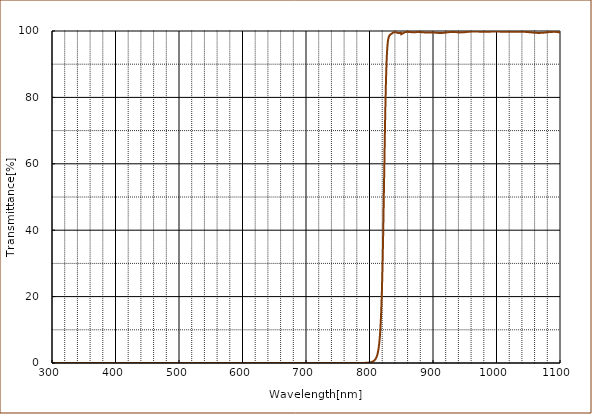
| Category | T% at AOI 0 deg |
|---|---|
| 1100.0 | 99.562 |
| 1099.5 | 99.598 |
| 1099.0 | 99.61 |
| 1098.5 | 99.617 |
| 1098.0 | 99.625 |
| 1097.5 | 99.64 |
| 1097.0 | 99.673 |
| 1096.5 | 99.697 |
| 1096.0 | 99.682 |
| 1095.5 | 99.689 |
| 1095.0 | 99.699 |
| 1094.5 | 99.74 |
| 1094.0 | 99.737 |
| 1093.5 | 99.712 |
| 1093.0 | 99.719 |
| 1092.5 | 99.74 |
| 1092.0 | 99.735 |
| 1091.5 | 99.736 |
| 1091.0 | 99.755 |
| 1090.5 | 99.763 |
| 1090.0 | 99.753 |
| 1089.5 | 99.756 |
| 1089.0 | 99.744 |
| 1088.5 | 99.749 |
| 1088.0 | 99.731 |
| 1087.5 | 99.726 |
| 1087.0 | 99.729 |
| 1086.5 | 99.74 |
| 1086.0 | 99.718 |
| 1085.5 | 99.715 |
| 1085.0 | 99.719 |
| 1084.5 | 99.703 |
| 1084.0 | 99.709 |
| 1083.5 | 99.689 |
| 1083.0 | 99.67 |
| 1082.5 | 99.682 |
| 1082.0 | 99.656 |
| 1081.5 | 99.635 |
| 1081.0 | 99.625 |
| 1080.5 | 99.623 |
| 1080.0 | 99.639 |
| 1079.5 | 99.619 |
| 1079.0 | 99.589 |
| 1078.5 | 99.582 |
| 1078.0 | 99.568 |
| 1077.5 | 99.548 |
| 1077.0 | 99.554 |
| 1076.5 | 99.538 |
| 1076.0 | 99.528 |
| 1075.5 | 99.52 |
| 1075.0 | 99.519 |
| 1074.5 | 99.494 |
| 1074.0 | 99.497 |
| 1073.5 | 99.483 |
| 1073.0 | 99.473 |
| 1072.5 | 99.481 |
| 1072.0 | 99.465 |
| 1071.5 | 99.438 |
| 1071.0 | 99.426 |
| 1070.5 | 99.442 |
| 1070.0 | 99.452 |
| 1069.5 | 99.453 |
| 1069.0 | 99.432 |
| 1068.5 | 99.422 |
| 1068.0 | 99.424 |
| 1067.5 | 99.428 |
| 1067.0 | 99.419 |
| 1066.5 | 99.423 |
| 1066.0 | 99.422 |
| 1065.5 | 99.427 |
| 1065.0 | 99.441 |
| 1064.5 | 99.437 |
| 1064.0 | 99.434 |
| 1063.5 | 99.446 |
| 1063.0 | 99.448 |
| 1062.5 | 99.439 |
| 1062.0 | 99.457 |
| 1061.5 | 99.455 |
| 1061.0 | 99.462 |
| 1060.5 | 99.48 |
| 1060.0 | 99.492 |
| 1059.5 | 99.493 |
| 1059.0 | 99.496 |
| 1058.5 | 99.517 |
| 1058.0 | 99.514 |
| 1057.5 | 99.532 |
| 1057.0 | 99.541 |
| 1056.5 | 99.524 |
| 1056.0 | 99.556 |
| 1055.5 | 99.579 |
| 1055.0 | 99.567 |
| 1054.5 | 99.573 |
| 1054.0 | 99.606 |
| 1053.5 | 99.606 |
| 1053.0 | 99.623 |
| 1052.5 | 99.627 |
| 1052.0 | 99.633 |
| 1051.5 | 99.636 |
| 1051.0 | 99.643 |
| 1050.5 | 99.662 |
| 1050.0 | 99.672 |
| 1049.5 | 99.687 |
| 1049.0 | 99.706 |
| 1048.5 | 99.707 |
| 1048.0 | 99.724 |
| 1047.5 | 99.708 |
| 1047.0 | 99.715 |
| 1046.5 | 99.724 |
| 1046.0 | 99.731 |
| 1045.5 | 99.747 |
| 1045.0 | 99.747 |
| 1044.5 | 99.76 |
| 1044.0 | 99.766 |
| 1043.5 | 99.766 |
| 1043.0 | 99.775 |
| 1042.5 | 99.775 |
| 1042.0 | 99.779 |
| 1041.5 | 99.777 |
| 1041.0 | 99.779 |
| 1040.5 | 99.786 |
| 1040.0 | 99.787 |
| 1039.5 | 99.785 |
| 1039.0 | 99.794 |
| 1038.5 | 99.797 |
| 1038.0 | 99.807 |
| 1037.5 | 99.8 |
| 1037.0 | 99.785 |
| 1036.5 | 99.79 |
| 1036.0 | 99.791 |
| 1035.5 | 99.793 |
| 1035.0 | 99.801 |
| 1034.5 | 99.792 |
| 1034.0 | 99.788 |
| 1033.5 | 99.79 |
| 1033.0 | 99.801 |
| 1032.5 | 99.798 |
| 1032.0 | 99.786 |
| 1031.5 | 99.784 |
| 1031.0 | 99.785 |
| 1030.5 | 99.776 |
| 1030.0 | 99.781 |
| 1029.5 | 99.782 |
| 1029.0 | 99.785 |
| 1028.5 | 99.78 |
| 1028.0 | 99.788 |
| 1027.5 | 99.773 |
| 1027.0 | 99.776 |
| 1026.5 | 99.772 |
| 1026.0 | 99.778 |
| 1025.5 | 99.762 |
| 1025.0 | 99.767 |
| 1024.5 | 99.766 |
| 1024.0 | 99.763 |
| 1023.5 | 99.772 |
| 1023.0 | 99.77 |
| 1022.5 | 99.769 |
| 1022.0 | 99.775 |
| 1021.5 | 99.767 |
| 1021.0 | 99.751 |
| 1020.5 | 99.759 |
| 1020.0 | 99.768 |
| 1019.5 | 99.761 |
| 1019.0 | 99.757 |
| 1018.5 | 99.78 |
| 1018.0 | 99.773 |
| 1017.5 | 99.776 |
| 1017.0 | 99.761 |
| 1016.5 | 99.779 |
| 1016.0 | 99.772 |
| 1015.5 | 99.764 |
| 1015.0 | 99.774 |
| 1014.5 | 99.783 |
| 1014.0 | 99.778 |
| 1013.5 | 99.776 |
| 1013.0 | 99.79 |
| 1012.5 | 99.783 |
| 1012.0 | 99.79 |
| 1011.5 | 99.79 |
| 1011.0 | 99.784 |
| 1010.5 | 99.79 |
| 1010.0 | 99.791 |
| 1009.5 | 99.793 |
| 1009.0 | 99.798 |
| 1008.5 | 99.814 |
| 1008.0 | 99.805 |
| 1007.5 | 99.805 |
| 1007.0 | 99.805 |
| 1006.5 | 99.806 |
| 1006.0 | 99.803 |
| 1005.5 | 99.81 |
| 1005.0 | 99.803 |
| 1004.5 | 99.811 |
| 1004.0 | 99.825 |
| 1003.5 | 99.807 |
| 1003.0 | 99.82 |
| 1002.5 | 99.829 |
| 1002.0 | 99.829 |
| 1001.5 | 99.811 |
| 1001.0 | 99.821 |
| 1000.5 | 99.826 |
| 1000.0 | 99.818 |
| 999.5 | 99.812 |
| 999.0 | 99.825 |
| 998.5 | 99.828 |
| 998.0 | 99.833 |
| 997.5 | 99.825 |
| 997.0 | 99.816 |
| 996.5 | 99.833 |
| 996.0 | 99.83 |
| 995.5 | 99.809 |
| 995.0 | 99.81 |
| 994.5 | 99.824 |
| 994.0 | 99.821 |
| 993.5 | 99.804 |
| 993.0 | 99.809 |
| 992.5 | 99.816 |
| 992.0 | 99.814 |
| 991.5 | 99.809 |
| 991.0 | 99.794 |
| 990.5 | 99.803 |
| 990.0 | 99.805 |
| 989.5 | 99.802 |
| 989.0 | 99.796 |
| 988.5 | 99.788 |
| 988.0 | 99.801 |
| 987.5 | 99.795 |
| 987.0 | 99.802 |
| 986.5 | 99.781 |
| 986.0 | 99.791 |
| 985.5 | 99.777 |
| 985.0 | 99.785 |
| 984.5 | 99.786 |
| 984.0 | 99.776 |
| 983.5 | 99.778 |
| 983.0 | 99.799 |
| 982.5 | 99.786 |
| 982.0 | 99.778 |
| 981.5 | 99.786 |
| 981.0 | 99.796 |
| 980.5 | 99.774 |
| 980.0 | 99.791 |
| 979.5 | 99.767 |
| 979.0 | 99.784 |
| 978.5 | 99.794 |
| 978.0 | 99.793 |
| 977.5 | 99.781 |
| 977.0 | 99.784 |
| 976.5 | 99.799 |
| 976.0 | 99.795 |
| 975.5 | 99.797 |
| 975.0 | 99.797 |
| 974.5 | 99.792 |
| 974.0 | 99.796 |
| 973.5 | 99.818 |
| 973.0 | 99.813 |
| 972.5 | 99.821 |
| 972.0 | 99.812 |
| 971.5 | 99.824 |
| 971.0 | 99.828 |
| 970.5 | 99.834 |
| 970.0 | 99.827 |
| 969.5 | 99.827 |
| 969.0 | 99.829 |
| 968.5 | 99.831 |
| 968.0 | 99.848 |
| 967.5 | 99.851 |
| 967.0 | 99.839 |
| 966.5 | 99.848 |
| 966.0 | 99.848 |
| 965.5 | 99.859 |
| 965.0 | 99.847 |
| 964.5 | 99.847 |
| 964.0 | 99.835 |
| 963.5 | 99.855 |
| 963.0 | 99.841 |
| 962.5 | 99.854 |
| 962.0 | 99.84 |
| 961.5 | 99.829 |
| 961.0 | 99.83 |
| 960.5 | 99.832 |
| 960.0 | 99.815 |
| 959.5 | 99.81 |
| 959.0 | 99.804 |
| 958.5 | 99.794 |
| 958.0 | 99.798 |
| 957.5 | 99.793 |
| 957.0 | 99.793 |
| 956.5 | 99.769 |
| 956.0 | 99.762 |
| 955.5 | 99.746 |
| 955.0 | 99.744 |
| 954.5 | 99.724 |
| 954.0 | 99.733 |
| 953.5 | 99.72 |
| 953.0 | 99.705 |
| 952.5 | 99.704 |
| 952.0 | 99.69 |
| 951.5 | 99.675 |
| 951.0 | 99.659 |
| 950.5 | 99.652 |
| 950.0 | 99.648 |
| 949.5 | 99.618 |
| 949.0 | 99.619 |
| 948.5 | 99.618 |
| 948.0 | 99.61 |
| 947.5 | 99.604 |
| 947.0 | 99.613 |
| 946.5 | 99.583 |
| 946.0 | 99.577 |
| 945.5 | 99.583 |
| 945.0 | 99.582 |
| 944.5 | 99.557 |
| 944.0 | 99.602 |
| 943.5 | 99.573 |
| 943.0 | 99.56 |
| 942.5 | 99.567 |
| 942.0 | 99.563 |
| 941.5 | 99.582 |
| 941.0 | 99.584 |
| 940.5 | 99.591 |
| 940.0 | 99.591 |
| 939.5 | 99.6 |
| 939.0 | 99.603 |
| 938.5 | 99.624 |
| 938.0 | 99.633 |
| 937.5 | 99.644 |
| 937.0 | 99.644 |
| 936.5 | 99.65 |
| 936.0 | 99.69 |
| 935.5 | 99.673 |
| 935.0 | 99.678 |
| 934.5 | 99.695 |
| 934.0 | 99.682 |
| 933.5 | 99.683 |
| 933.0 | 99.703 |
| 932.5 | 99.701 |
| 932.0 | 99.717 |
| 931.5 | 99.68 |
| 931.0 | 99.724 |
| 930.5 | 99.711 |
| 930.0 | 99.708 |
| 929.5 | 99.701 |
| 929.0 | 99.699 |
| 928.5 | 99.692 |
| 928.0 | 99.691 |
| 927.5 | 99.681 |
| 927.0 | 99.685 |
| 926.5 | 99.68 |
| 926.0 | 99.673 |
| 925.5 | 99.666 |
| 925.0 | 99.652 |
| 924.5 | 99.634 |
| 924.0 | 99.614 |
| 923.5 | 99.609 |
| 923.0 | 99.597 |
| 922.5 | 99.586 |
| 922.0 | 99.587 |
| 921.5 | 99.575 |
| 921.0 | 99.569 |
| 920.5 | 99.551 |
| 920.0 | 99.534 |
| 919.5 | 99.517 |
| 919.0 | 99.503 |
| 918.5 | 99.486 |
| 918.0 | 99.475 |
| 917.5 | 99.477 |
| 917.0 | 99.467 |
| 916.5 | 99.459 |
| 916.0 | 99.454 |
| 915.5 | 99.446 |
| 915.0 | 99.427 |
| 914.5 | 99.425 |
| 914.0 | 99.411 |
| 913.5 | 99.414 |
| 913.0 | 99.402 |
| 912.5 | 99.407 |
| 912.0 | 99.412 |
| 911.5 | 99.418 |
| 911.0 | 99.428 |
| 910.5 | 99.422 |
| 910.0 | 99.42 |
| 909.5 | 99.419 |
| 909.0 | 99.424 |
| 908.5 | 99.433 |
| 908.0 | 99.434 |
| 907.5 | 99.443 |
| 907.0 | 99.453 |
| 906.5 | 99.465 |
| 906.0 | 99.475 |
| 905.5 | 99.478 |
| 905.0 | 99.49 |
| 904.5 | 99.496 |
| 904.0 | 99.495 |
| 903.5 | 99.506 |
| 903.0 | 99.515 |
| 902.5 | 99.528 |
| 902.0 | 99.534 |
| 901.5 | 99.545 |
| 901.0 | 99.557 |
| 900.5 | 99.565 |
| 900.0 | 99.568 |
| 899.5 | 99.564 |
| 899.0 | 99.564 |
| 898.5 | 99.565 |
| 898.0 | 99.567 |
| 897.5 | 99.573 |
| 897.0 | 99.58 |
| 896.5 | 99.579 |
| 896.0 | 99.582 |
| 895.5 | 99.58 |
| 895.0 | 99.572 |
| 894.5 | 99.571 |
| 894.0 | 99.566 |
| 893.5 | 99.568 |
| 893.0 | 99.562 |
| 892.5 | 99.56 |
| 892.0 | 99.566 |
| 891.5 | 99.564 |
| 891.0 | 99.569 |
| 890.5 | 99.571 |
| 890.0 | 99.568 |
| 889.5 | 99.568 |
| 889.0 | 99.564 |
| 888.5 | 99.56 |
| 888.0 | 99.559 |
| 887.5 | 99.569 |
| 887.0 | 99.572 |
| 886.5 | 99.586 |
| 886.0 | 99.587 |
| 885.5 | 99.596 |
| 885.0 | 99.594 |
| 884.5 | 99.601 |
| 884.0 | 99.604 |
| 883.5 | 99.61 |
| 883.0 | 99.617 |
| 882.5 | 99.619 |
| 882.0 | 99.632 |
| 881.5 | 99.642 |
| 881.0 | 99.654 |
| 880.5 | 99.656 |
| 880.0 | 99.671 |
| 879.5 | 99.67 |
| 879.0 | 99.667 |
| 878.5 | 99.67 |
| 878.0 | 99.666 |
| 877.5 | 99.667 |
| 877.0 | 99.675 |
| 876.5 | 99.678 |
| 876.0 | 99.676 |
| 875.5 | 99.68 |
| 875.0 | 99.673 |
| 874.5 | 99.673 |
| 874.0 | 99.665 |
| 873.5 | 99.659 |
| 873.0 | 99.646 |
| 872.5 | 99.65 |
| 872.0 | 99.635 |
| 871.5 | 99.637 |
| 871.0 | 99.64 |
| 870.5 | 99.638 |
| 870.0 | 99.631 |
| 869.5 | 99.624 |
| 869.0 | 99.626 |
| 868.5 | 99.619 |
| 868.0 | 99.621 |
| 867.5 | 99.623 |
| 867.0 | 99.628 |
| 866.5 | 99.635 |
| 866.0 | 99.648 |
| 865.5 | 99.654 |
| 865.0 | 99.661 |
| 864.5 | 99.672 |
| 864.0 | 99.678 |
| 863.5 | 99.687 |
| 863.0 | 99.695 |
| 862.5 | 99.699 |
| 862.0 | 99.717 |
| 861.5 | 99.732 |
| 861.0 | 99.741 |
| 860.5 | 99.75 |
| 860.0 | 99.745 |
| 859.5 | 99.749 |
| 859.0 | 99.741 |
| 858.5 | 99.727 |
| 858.0 | 99.722 |
| 857.5 | 99.706 |
| 857.0 | 99.685 |
| 856.5 | 99.664 |
| 856.0 | 99.634 |
| 855.5 | 99.599 |
| 855.0 | 99.566 |
| 854.5 | 99.523 |
| 854.0 | 99.463 |
| 853.5 | 99.413 |
| 853.0 | 99.36 |
| 852.5 | 99.3 |
| 852.0 | 99.248 |
| 851.5 | 99.195 |
| 851.0 | 99.137 |
| 850.5 | 99.08 |
| 850.0 | 99.032 |
| 849.5 | 99.509 |
| 849.0 | 99.529 |
| 848.5 | 99.473 |
| 848.0 | 99.472 |
| 847.5 | 99.398 |
| 847.0 | 99.403 |
| 846.5 | 99.412 |
| 846.0 | 99.401 |
| 845.5 | 99.357 |
| 845.0 | 99.483 |
| 844.5 | 99.441 |
| 844.0 | 99.469 |
| 843.5 | 99.53 |
| 843.0 | 99.494 |
| 842.5 | 99.486 |
| 842.0 | 99.553 |
| 841.5 | 99.621 |
| 841.0 | 99.59 |
| 840.5 | 99.627 |
| 840.0 | 99.662 |
| 839.5 | 99.639 |
| 839.0 | 99.612 |
| 838.5 | 99.602 |
| 838.0 | 99.589 |
| 837.5 | 99.575 |
| 837.0 | 99.459 |
| 836.5 | 99.472 |
| 836.0 | 99.43 |
| 835.5 | 99.267 |
| 835.0 | 99.247 |
| 834.5 | 99.215 |
| 834.0 | 99.102 |
| 833.5 | 99.028 |
| 833.0 | 98.962 |
| 832.5 | 98.875 |
| 832.0 | 98.746 |
| 831.5 | 98.692 |
| 831.0 | 98.529 |
| 830.5 | 98.273 |
| 830.0 | 98.005 |
| 829.5 | 97.586 |
| 829.0 | 96.942 |
| 828.5 | 96.068 |
| 828.0 | 94.849 |
| 827.5 | 93.3 |
| 827.0 | 91.175 |
| 826.5 | 88.598 |
| 826.0 | 85.379 |
| 825.5 | 81.54 |
| 825.0 | 77.096 |
| 824.5 | 72.147 |
| 824.0 | 66.769 |
| 823.5 | 61.072 |
| 823.0 | 55.259 |
| 822.5 | 49.5 |
| 822.0 | 43.799 |
| 821.5 | 38.552 |
| 821.0 | 33.68 |
| 820.5 | 29.118 |
| 820.0 | 25.117 |
| 819.5 | 21.631 |
| 819.0 | 18.484 |
| 818.5 | 15.813 |
| 818.0 | 13.548 |
| 817.5 | 11.555 |
| 817.0 | 9.885 |
| 816.5 | 8.465 |
| 816.0 | 7.256 |
| 815.5 | 6.229 |
| 815.0 | 5.363 |
| 814.5 | 4.627 |
| 814.0 | 3.995 |
| 813.5 | 3.457 |
| 813.0 | 3.006 |
| 812.5 | 2.608 |
| 812.0 | 2.279 |
| 811.5 | 2.001 |
| 811.0 | 1.748 |
| 810.5 | 1.535 |
| 810.0 | 1.352 |
| 809.5 | 1.191 |
| 809.0 | 1.056 |
| 808.5 | 0.936 |
| 808.0 | 0.83 |
| 807.5 | 0.739 |
| 807.0 | 0.658 |
| 806.5 | 0.588 |
| 806.0 | 0.524 |
| 805.5 | 0.469 |
| 805.0 | 0.421 |
| 804.5 | 0.377 |
| 804.0 | 0.339 |
| 803.5 | 0.305 |
| 803.0 | 0.275 |
| 802.5 | 0.248 |
| 802.0 | 0.223 |
| 801.5 | 0.202 |
| 801.0 | 0.183 |
| 800.5 | 0.165 |
| 800.0 | 0.15 |
| 799.5 | 0.135 |
| 799.0 | 0.122 |
| 798.5 | 0.11 |
| 798.0 | 0.1 |
| 797.5 | 0.091 |
| 797.0 | 0.082 |
| 796.5 | 0.075 |
| 796.0 | 0.068 |
| 795.5 | 0.061 |
| 795.0 | 0.055 |
| 794.5 | 0.05 |
| 794.0 | 0.046 |
| 793.5 | 0.041 |
| 793.0 | 0.037 |
| 792.5 | 0.034 |
| 792.0 | 0.031 |
| 791.5 | 0.028 |
| 791.0 | 0.025 |
| 790.5 | 0.023 |
| 790.0 | 0.02 |
| 789.5 | 0.019 |
| 789.0 | 0.017 |
| 788.5 | 0.015 |
| 788.0 | 0.014 |
| 787.5 | 0.013 |
| 787.0 | 0.011 |
| 786.5 | 0.01 |
| 786.0 | 0.01 |
| 785.5 | 0.009 |
| 785.0 | 0.007 |
| 784.5 | 0.007 |
| 784.0 | 0.006 |
| 783.5 | 0.006 |
| 783.0 | 0.005 |
| 782.5 | 0.005 |
| 782.0 | 0.005 |
| 781.5 | 0.004 |
| 781.0 | 0.004 |
| 780.5 | 0.003 |
| 780.0 | 0.003 |
| 779.5 | 0.003 |
| 779.0 | 0.002 |
| 778.5 | 0.003 |
| 778.0 | 0.002 |
| 777.5 | 0.002 |
| 777.0 | 0.002 |
| 776.5 | 0.002 |
| 776.0 | 0.002 |
| 775.5 | 0.001 |
| 775.0 | 0.001 |
| 774.5 | 0.002 |
| 774.0 | 0.001 |
| 773.5 | 0.002 |
| 773.0 | 0.001 |
| 772.5 | 0.001 |
| 772.0 | 0.001 |
| 771.5 | 0.001 |
| 771.0 | 0.001 |
| 770.5 | 0.001 |
| 770.0 | 0.001 |
| 769.5 | 0.001 |
| 769.0 | 0.001 |
| 768.5 | 0.001 |
| 768.0 | 0 |
| 767.5 | 0 |
| 767.0 | 0 |
| 766.5 | 0.001 |
| 766.0 | 0 |
| 765.5 | 0.001 |
| 765.0 | 0 |
| 764.5 | 0.001 |
| 764.0 | 0 |
| 763.5 | 0.001 |
| 763.0 | 0.001 |
| 762.5 | 0.001 |
| 762.0 | 0.001 |
| 761.5 | 0.001 |
| 761.0 | 0.001 |
| 760.5 | 0 |
| 760.0 | 0 |
| 759.5 | 0 |
| 759.0 | 0 |
| 758.5 | 0 |
| 758.0 | 0 |
| 757.5 | 0 |
| 757.0 | 0 |
| 756.5 | 0 |
| 756.0 | 0 |
| 755.5 | 0 |
| 755.0 | 0 |
| 754.5 | 0 |
| 754.0 | 0.001 |
| 753.5 | 0 |
| 753.0 | 0 |
| 752.5 | 0 |
| 752.0 | 0 |
| 751.5 | 0 |
| 751.0 | 0 |
| 750.5 | 0 |
| 750.0 | 0 |
| 749.5 | 0 |
| 749.0 | 0 |
| 748.5 | 0 |
| 748.0 | 0 |
| 747.5 | 0 |
| 747.0 | 0 |
| 746.5 | 0 |
| 746.0 | 0 |
| 745.5 | 0 |
| 745.0 | 0 |
| 744.5 | 0 |
| 744.0 | 0 |
| 743.5 | 0 |
| 743.0 | 0 |
| 742.5 | 0 |
| 742.0 | 0 |
| 741.5 | 0 |
| 741.0 | 0 |
| 740.5 | 0 |
| 740.0 | 0 |
| 739.5 | 0 |
| 739.0 | 0 |
| 738.5 | 0 |
| 738.0 | 0 |
| 737.5 | 0 |
| 737.0 | 0 |
| 736.5 | 0 |
| 736.0 | 0 |
| 735.5 | 0 |
| 735.0 | 0 |
| 734.5 | 0 |
| 734.0 | 0 |
| 733.5 | 0 |
| 733.0 | 0 |
| 732.5 | 0 |
| 732.0 | 0 |
| 731.5 | 0 |
| 731.0 | 0 |
| 730.5 | 0 |
| 730.0 | 0 |
| 729.5 | 0 |
| 729.0 | 0 |
| 728.5 | 0 |
| 728.0 | 0 |
| 727.5 | 0 |
| 727.0 | 0 |
| 726.5 | 0 |
| 726.0 | 0 |
| 725.5 | 0 |
| 725.0 | 0 |
| 724.5 | 0 |
| 724.0 | 0 |
| 723.5 | 0 |
| 723.0 | 0 |
| 722.5 | 0 |
| 722.0 | 0 |
| 721.5 | 0 |
| 721.0 | 0 |
| 720.5 | 0 |
| 720.0 | 0 |
| 719.5 | 0 |
| 719.0 | 0 |
| 718.5 | 0 |
| 718.0 | 0 |
| 717.5 | 0 |
| 717.0 | 0 |
| 716.5 | 0 |
| 716.0 | 0 |
| 715.5 | 0 |
| 715.0 | 0 |
| 714.5 | 0 |
| 714.0 | 0 |
| 713.5 | -0.001 |
| 713.0 | 0 |
| 712.5 | 0 |
| 712.0 | 0 |
| 711.5 | 0 |
| 711.0 | 0 |
| 710.5 | 0 |
| 710.0 | 0 |
| 709.5 | 0 |
| 709.0 | 0 |
| 708.5 | 0 |
| 708.0 | 0 |
| 707.5 | 0 |
| 707.0 | 0 |
| 706.5 | 0 |
| 706.0 | 0 |
| 705.5 | 0 |
| 705.0 | 0 |
| 704.5 | 0 |
| 704.0 | 0 |
| 703.5 | 0 |
| 703.0 | 0 |
| 702.5 | 0 |
| 702.0 | 0 |
| 701.5 | 0 |
| 701.0 | 0 |
| 700.5 | 0 |
| 700.0 | 0 |
| 699.5 | 0 |
| 699.0 | 0 |
| 698.5 | 0 |
| 698.0 | 0 |
| 697.5 | 0 |
| 697.0 | 0 |
| 696.5 | 0 |
| 696.0 | 0 |
| 695.5 | 0 |
| 695.0 | 0 |
| 694.5 | 0 |
| 694.0 | 0 |
| 693.5 | 0 |
| 693.0 | 0 |
| 692.5 | 0 |
| 692.0 | 0 |
| 691.5 | 0 |
| 691.0 | 0 |
| 690.5 | 0 |
| 690.0 | 0 |
| 689.5 | 0 |
| 689.0 | 0 |
| 688.5 | 0 |
| 688.0 | 0 |
| 687.5 | 0 |
| 687.0 | 0 |
| 686.5 | 0 |
| 686.0 | 0 |
| 685.5 | 0 |
| 685.0 | 0 |
| 684.5 | 0 |
| 684.0 | 0 |
| 683.5 | 0 |
| 683.0 | 0 |
| 682.5 | 0 |
| 682.0 | 0 |
| 681.5 | 0 |
| 681.0 | 0 |
| 680.5 | 0 |
| 680.0 | 0 |
| 679.5 | 0 |
| 679.0 | 0 |
| 678.5 | 0 |
| 678.0 | 0 |
| 677.5 | 0 |
| 677.0 | 0 |
| 676.5 | 0 |
| 676.0 | 0 |
| 675.5 | 0 |
| 675.0 | 0 |
| 674.5 | 0 |
| 674.0 | 0 |
| 673.5 | 0 |
| 673.0 | 0 |
| 672.5 | 0 |
| 672.0 | 0 |
| 671.5 | 0 |
| 671.0 | 0 |
| 670.5 | 0 |
| 670.0 | 0 |
| 669.5 | 0 |
| 669.0 | 0 |
| 668.5 | 0 |
| 668.0 | 0 |
| 667.5 | 0 |
| 667.0 | 0 |
| 666.5 | 0 |
| 666.0 | 0 |
| 665.5 | 0 |
| 665.0 | 0 |
| 664.5 | 0 |
| 664.0 | 0 |
| 663.5 | 0 |
| 663.0 | 0 |
| 662.5 | 0 |
| 662.0 | 0 |
| 661.5 | 0 |
| 661.0 | 0 |
| 660.5 | 0 |
| 660.0 | 0 |
| 659.5 | 0 |
| 659.0 | 0 |
| 658.5 | 0 |
| 658.0 | 0 |
| 657.5 | 0 |
| 657.0 | 0 |
| 656.5 | 0 |
| 656.0 | 0 |
| 655.5 | 0 |
| 655.0 | 0 |
| 654.5 | 0 |
| 654.0 | 0 |
| 653.5 | 0 |
| 653.0 | 0 |
| 652.5 | 0 |
| 652.0 | 0 |
| 651.5 | 0 |
| 651.0 | 0 |
| 650.5 | 0 |
| 650.0 | 0 |
| 649.5 | 0 |
| 649.0 | 0 |
| 648.5 | 0 |
| 648.0 | 0 |
| 647.5 | 0 |
| 647.0 | 0 |
| 646.5 | 0 |
| 646.0 | 0 |
| 645.5 | 0 |
| 645.0 | 0 |
| 644.5 | 0 |
| 644.0 | 0 |
| 643.5 | 0 |
| 643.0 | 0 |
| 642.5 | 0 |
| 642.0 | 0 |
| 641.5 | 0 |
| 641.0 | 0 |
| 640.5 | 0 |
| 640.0 | 0 |
| 639.5 | 0 |
| 639.0 | 0 |
| 638.5 | 0 |
| 638.0 | 0 |
| 637.5 | 0 |
| 637.0 | 0 |
| 636.5 | 0 |
| 636.0 | 0 |
| 635.5 | 0 |
| 635.0 | 0 |
| 634.5 | 0 |
| 634.0 | 0 |
| 633.5 | 0 |
| 633.0 | 0 |
| 632.5 | 0 |
| 632.0 | 0 |
| 631.5 | 0 |
| 631.0 | 0 |
| 630.5 | 0 |
| 630.0 | 0 |
| 629.5 | 0 |
| 629.0 | 0 |
| 628.5 | 0 |
| 628.0 | 0 |
| 627.5 | 0 |
| 627.0 | 0 |
| 626.5 | 0 |
| 626.0 | 0 |
| 625.5 | 0 |
| 625.0 | 0 |
| 624.5 | 0 |
| 624.0 | 0 |
| 623.5 | 0 |
| 623.0 | 0 |
| 622.5 | 0 |
| 622.0 | 0.001 |
| 621.5 | 0 |
| 621.0 | 0.001 |
| 620.5 | 0.001 |
| 620.0 | 0.001 |
| 619.5 | 0.001 |
| 619.0 | 0.001 |
| 618.5 | 0.001 |
| 618.0 | 0.001 |
| 617.5 | 0.001 |
| 617.0 | 0 |
| 616.5 | 0 |
| 616.0 | 0 |
| 615.5 | 0 |
| 615.0 | 0 |
| 614.5 | 0 |
| 614.0 | 0 |
| 613.5 | 0 |
| 613.0 | 0 |
| 612.5 | 0 |
| 612.0 | 0 |
| 611.5 | 0 |
| 611.0 | 0 |
| 610.5 | 0.001 |
| 610.0 | 0 |
| 609.5 | 0 |
| 609.0 | 0 |
| 608.5 | 0 |
| 608.0 | 0 |
| 607.5 | 0 |
| 607.0 | 0 |
| 606.5 | 0 |
| 606.0 | 0 |
| 605.5 | 0 |
| 605.0 | 0 |
| 604.5 | 0 |
| 604.0 | 0 |
| 603.5 | 0 |
| 603.0 | 0 |
| 602.5 | 0 |
| 602.0 | 0 |
| 601.5 | 0 |
| 601.0 | 0 |
| 600.5 | 0 |
| 600.0 | 0 |
| 599.5 | 0 |
| 599.0 | 0 |
| 598.5 | 0 |
| 598.0 | 0 |
| 597.5 | 0 |
| 597.0 | 0 |
| 596.5 | 0 |
| 596.0 | 0 |
| 595.5 | 0 |
| 595.0 | 0 |
| 594.5 | 0 |
| 594.0 | 0 |
| 593.5 | 0 |
| 593.0 | 0 |
| 592.5 | 0 |
| 592.0 | 0 |
| 591.5 | 0 |
| 591.0 | 0 |
| 590.5 | 0 |
| 590.0 | 0 |
| 589.5 | 0 |
| 589.0 | 0 |
| 588.5 | 0 |
| 588.0 | 0 |
| 587.5 | 0 |
| 587.0 | 0 |
| 586.5 | 0 |
| 586.0 | 0 |
| 585.5 | 0 |
| 585.0 | 0 |
| 584.5 | 0 |
| 584.0 | 0 |
| 583.5 | 0 |
| 583.0 | 0 |
| 582.5 | 0 |
| 582.0 | 0 |
| 581.5 | 0 |
| 581.0 | 0 |
| 580.5 | 0 |
| 580.0 | 0 |
| 579.5 | 0 |
| 579.0 | 0 |
| 578.5 | 0 |
| 578.0 | 0 |
| 577.5 | 0 |
| 577.0 | 0 |
| 576.5 | 0 |
| 576.0 | 0 |
| 575.5 | 0 |
| 575.0 | 0 |
| 574.5 | 0 |
| 574.0 | 0 |
| 573.5 | 0 |
| 573.0 | 0 |
| 572.5 | 0 |
| 572.0 | 0 |
| 571.5 | 0 |
| 571.0 | 0 |
| 570.5 | 0 |
| 570.0 | 0 |
| 569.5 | 0 |
| 569.0 | 0 |
| 568.5 | 0 |
| 568.0 | 0 |
| 567.5 | 0 |
| 567.0 | 0 |
| 566.5 | 0 |
| 566.0 | 0 |
| 565.5 | 0 |
| 565.0 | 0 |
| 564.5 | 0 |
| 564.0 | 0 |
| 563.5 | 0 |
| 563.0 | 0 |
| 562.5 | 0 |
| 562.0 | 0 |
| 561.5 | 0 |
| 561.0 | 0 |
| 560.5 | 0 |
| 560.0 | 0 |
| 559.5 | 0 |
| 559.0 | 0 |
| 558.5 | 0 |
| 558.0 | 0 |
| 557.5 | 0 |
| 557.0 | 0 |
| 556.5 | 0 |
| 556.0 | 0 |
| 555.5 | 0 |
| 555.0 | 0 |
| 554.5 | 0 |
| 554.0 | 0 |
| 553.5 | 0 |
| 553.0 | 0 |
| 552.5 | 0 |
| 552.0 | 0 |
| 551.5 | 0 |
| 551.0 | 0 |
| 550.5 | 0 |
| 550.0 | 0 |
| 549.5 | 0 |
| 549.0 | 0 |
| 548.5 | 0 |
| 548.0 | 0 |
| 547.5 | 0 |
| 547.0 | 0 |
| 546.5 | 0 |
| 546.0 | 0 |
| 545.5 | 0 |
| 545.0 | 0 |
| 544.5 | 0 |
| 544.0 | 0 |
| 543.5 | 0 |
| 543.0 | 0 |
| 542.5 | 0 |
| 542.0 | 0 |
| 541.5 | 0 |
| 541.0 | 0 |
| 540.5 | 0 |
| 540.0 | 0 |
| 539.5 | 0 |
| 539.0 | 0 |
| 538.5 | 0 |
| 538.0 | 0 |
| 537.5 | 0 |
| 537.0 | 0 |
| 536.5 | 0 |
| 536.0 | 0 |
| 535.5 | 0 |
| 535.0 | 0 |
| 534.5 | 0 |
| 534.0 | 0 |
| 533.5 | 0 |
| 533.0 | 0 |
| 532.5 | 0 |
| 532.0 | 0 |
| 531.5 | 0 |
| 531.0 | 0 |
| 530.5 | 0 |
| 530.0 | 0 |
| 529.5 | 0 |
| 529.0 | 0 |
| 528.5 | 0 |
| 528.0 | 0 |
| 527.5 | 0 |
| 527.0 | 0 |
| 526.5 | 0 |
| 526.0 | 0 |
| 525.5 | 0 |
| 525.0 | 0 |
| 524.5 | 0 |
| 524.0 | 0 |
| 523.5 | 0 |
| 523.0 | 0 |
| 522.5 | 0 |
| 522.0 | 0 |
| 521.5 | 0 |
| 521.0 | 0 |
| 520.5 | 0 |
| 520.0 | 0 |
| 519.5 | 0 |
| 519.0 | 0 |
| 518.5 | 0 |
| 518.0 | 0 |
| 517.5 | 0 |
| 517.0 | 0 |
| 516.5 | 0 |
| 516.0 | 0 |
| 515.5 | 0 |
| 515.0 | 0 |
| 514.5 | 0 |
| 514.0 | 0 |
| 513.5 | 0 |
| 513.0 | 0 |
| 512.5 | 0 |
| 512.0 | 0 |
| 511.5 | 0 |
| 511.0 | 0 |
| 510.5 | 0 |
| 510.0 | 0 |
| 509.5 | 0 |
| 509.0 | 0 |
| 508.5 | 0 |
| 508.0 | 0 |
| 507.5 | 0 |
| 507.0 | 0 |
| 506.5 | 0 |
| 506.0 | 0 |
| 505.5 | 0 |
| 505.0 | 0 |
| 504.5 | 0 |
| 504.0 | 0 |
| 503.5 | 0 |
| 503.0 | 0 |
| 502.5 | 0 |
| 502.0 | 0 |
| 501.5 | 0 |
| 501.0 | 0 |
| 500.5 | 0 |
| 500.0 | 0 |
| 499.5 | 0 |
| 499.0 | 0 |
| 498.5 | 0 |
| 498.0 | 0 |
| 497.5 | 0 |
| 497.0 | 0 |
| 496.5 | 0 |
| 496.0 | 0 |
| 495.5 | 0 |
| 495.0 | 0 |
| 494.5 | 0 |
| 494.0 | 0 |
| 493.5 | 0 |
| 493.0 | 0 |
| 492.5 | 0 |
| 492.0 | 0 |
| 491.5 | 0 |
| 491.0 | 0 |
| 490.5 | 0 |
| 490.0 | 0 |
| 489.5 | 0 |
| 489.0 | 0 |
| 488.5 | 0 |
| 488.0 | 0 |
| 487.5 | 0 |
| 487.0 | 0 |
| 486.5 | 0 |
| 486.0 | 0 |
| 485.5 | 0 |
| 485.0 | 0 |
| 484.5 | 0 |
| 484.0 | 0 |
| 483.5 | 0 |
| 483.0 | 0 |
| 482.5 | 0 |
| 482.0 | 0 |
| 481.5 | 0 |
| 481.0 | 0 |
| 480.5 | 0 |
| 480.0 | 0 |
| 479.5 | 0 |
| 479.0 | 0 |
| 478.5 | 0 |
| 478.0 | 0 |
| 477.5 | 0 |
| 477.0 | 0 |
| 476.5 | 0 |
| 476.0 | 0 |
| 475.5 | 0 |
| 475.0 | 0 |
| 474.5 | 0 |
| 474.0 | 0 |
| 473.5 | 0 |
| 473.0 | 0 |
| 472.5 | 0 |
| 472.0 | 0 |
| 471.5 | 0 |
| 471.0 | 0 |
| 470.5 | 0 |
| 470.0 | 0 |
| 469.5 | 0 |
| 469.0 | 0 |
| 468.5 | 0 |
| 468.0 | 0 |
| 467.5 | 0 |
| 467.0 | 0 |
| 466.5 | 0 |
| 466.0 | 0 |
| 465.5 | 0 |
| 465.0 | 0 |
| 464.5 | 0 |
| 464.0 | 0 |
| 463.5 | 0 |
| 463.0 | 0 |
| 462.5 | 0 |
| 462.0 | 0 |
| 461.5 | 0 |
| 461.0 | 0 |
| 460.5 | 0 |
| 460.0 | 0 |
| 459.5 | 0 |
| 459.0 | 0 |
| 458.5 | 0 |
| 458.0 | 0 |
| 457.5 | 0 |
| 457.0 | 0 |
| 456.5 | 0 |
| 456.0 | 0 |
| 455.5 | 0 |
| 455.0 | 0 |
| 454.5 | 0 |
| 454.0 | 0 |
| 453.5 | 0 |
| 453.0 | 0 |
| 452.5 | 0 |
| 452.0 | 0 |
| 451.5 | 0 |
| 451.0 | 0 |
| 450.5 | 0 |
| 450.0 | 0 |
| 449.5 | 0 |
| 449.0 | 0 |
| 448.5 | 0 |
| 448.0 | 0 |
| 447.5 | 0 |
| 447.0 | 0 |
| 446.5 | 0 |
| 446.0 | 0 |
| 445.5 | 0 |
| 445.0 | 0 |
| 444.5 | 0 |
| 444.0 | 0 |
| 443.5 | 0 |
| 443.0 | 0 |
| 442.5 | 0 |
| 442.0 | 0 |
| 441.5 | 0 |
| 441.0 | 0 |
| 440.5 | 0 |
| 440.0 | 0 |
| 439.5 | 0 |
| 439.0 | 0 |
| 438.5 | 0 |
| 438.0 | 0 |
| 437.5 | 0 |
| 437.0 | 0 |
| 436.5 | 0 |
| 436.0 | 0 |
| 435.5 | 0 |
| 435.0 | 0 |
| 434.5 | 0 |
| 434.0 | 0 |
| 433.5 | 0 |
| 433.0 | 0 |
| 432.5 | 0 |
| 432.0 | 0 |
| 431.5 | 0 |
| 431.0 | 0 |
| 430.5 | 0 |
| 430.0 | 0 |
| 429.5 | 0.001 |
| 429.0 | 0 |
| 428.5 | 0 |
| 428.0 | 0 |
| 427.5 | 0 |
| 427.0 | 0 |
| 426.5 | 0 |
| 426.0 | 0 |
| 425.5 | 0 |
| 425.0 | 0 |
| 424.5 | 0 |
| 424.0 | 0 |
| 423.5 | 0 |
| 423.0 | 0 |
| 422.5 | 0 |
| 422.0 | 0 |
| 421.5 | 0 |
| 421.0 | 0 |
| 420.5 | 0 |
| 420.0 | 0 |
| 419.5 | 0 |
| 419.0 | 0 |
| 418.5 | 0 |
| 418.0 | 0 |
| 417.5 | 0 |
| 417.0 | 0 |
| 416.5 | 0 |
| 416.0 | 0 |
| 415.5 | 0 |
| 415.0 | 0.001 |
| 414.5 | 0.001 |
| 414.0 | 0.002 |
| 413.5 | 0.002 |
| 413.0 | 0.002 |
| 412.5 | 0.002 |
| 412.0 | 0.001 |
| 411.5 | 0.001 |
| 411.0 | 0 |
| 410.5 | 0 |
| 410.0 | 0 |
| 409.5 | 0 |
| 409.0 | 0 |
| 408.5 | 0 |
| 408.0 | 0 |
| 407.5 | 0 |
| 407.0 | 0 |
| 406.5 | 0 |
| 406.0 | 0 |
| 405.5 | 0 |
| 405.0 | 0 |
| 404.5 | 0 |
| 404.0 | 0 |
| 403.5 | 0 |
| 403.0 | 0 |
| 402.5 | 0 |
| 402.0 | 0 |
| 401.5 | 0 |
| 401.0 | 0 |
| 400.5 | 0 |
| 400.0 | 0 |
| 399.5 | 0 |
| 399.0 | 0 |
| 398.5 | 0 |
| 398.0 | 0 |
| 397.5 | 0 |
| 397.0 | 0 |
| 396.5 | 0 |
| 396.0 | 0 |
| 395.5 | 0 |
| 395.0 | 0 |
| 394.5 | 0 |
| 394.0 | 0 |
| 393.5 | 0 |
| 393.0 | 0 |
| 392.5 | 0 |
| 392.0 | 0 |
| 391.5 | 0 |
| 391.0 | 0 |
| 390.5 | 0 |
| 390.0 | 0 |
| 389.5 | 0 |
| 389.0 | 0 |
| 388.5 | 0 |
| 388.0 | 0 |
| 387.5 | 0 |
| 387.0 | 0 |
| 386.5 | 0 |
| 386.0 | 0 |
| 385.5 | 0 |
| 385.0 | 0 |
| 384.5 | 0 |
| 384.0 | 0 |
| 383.5 | 0 |
| 383.0 | 0.001 |
| 382.5 | 0 |
| 382.0 | 0 |
| 381.5 | 0.001 |
| 381.0 | 0.001 |
| 380.5 | 0.001 |
| 380.0 | 0 |
| 379.5 | 0 |
| 379.0 | 0 |
| 378.5 | 0 |
| 378.0 | 0 |
| 377.5 | 0 |
| 377.0 | 0 |
| 376.5 | 0 |
| 376.0 | 0 |
| 375.5 | 0 |
| 375.0 | 0 |
| 374.5 | 0 |
| 374.0 | 0 |
| 373.5 | 0 |
| 373.0 | 0 |
| 372.5 | 0 |
| 372.0 | 0 |
| 371.5 | 0 |
| 371.0 | 0.001 |
| 370.5 | 0 |
| 370.0 | 0 |
| 369.5 | 0 |
| 369.0 | 0 |
| 368.5 | 0 |
| 368.0 | 0 |
| 367.5 | 0 |
| 367.0 | 0 |
| 366.5 | 0 |
| 366.0 | 0 |
| 365.5 | 0 |
| 365.0 | -0.001 |
| 364.5 | 0 |
| 364.0 | 0 |
| 363.5 | 0 |
| 363.0 | 0 |
| 362.5 | 0 |
| 362.0 | 0 |
| 361.5 | 0 |
| 361.0 | 0 |
| 360.5 | 0 |
| 360.0 | 0 |
| 359.5 | 0 |
| 359.0 | 0 |
| 358.5 | 0 |
| 358.0 | 0 |
| 357.5 | 0 |
| 357.0 | 0 |
| 356.5 | 0 |
| 356.0 | 0 |
| 355.5 | 0 |
| 355.0 | 0 |
| 354.5 | 0 |
| 354.0 | 0 |
| 353.5 | 0 |
| 353.0 | 0 |
| 352.5 | 0 |
| 352.0 | 0 |
| 351.5 | 0 |
| 351.0 | 0 |
| 350.5 | 0 |
| 350.0 | 0 |
| 349.5 | 0 |
| 349.0 | 0 |
| 348.5 | 0 |
| 348.0 | 0 |
| 347.5 | 0 |
| 347.0 | 0 |
| 346.5 | 0 |
| 346.0 | 0 |
| 345.5 | 0 |
| 345.0 | 0 |
| 344.5 | 0 |
| 344.0 | 0 |
| 343.5 | 0 |
| 343.0 | 0 |
| 342.5 | 0 |
| 342.0 | 0 |
| 341.5 | 0 |
| 341.0 | 0 |
| 340.5 | 0 |
| 340.0 | 0 |
| 339.5 | 0 |
| 339.0 | 0 |
| 338.5 | 0 |
| 338.0 | 0 |
| 337.5 | 0 |
| 337.0 | 0 |
| 336.5 | 0 |
| 336.0 | 0 |
| 335.5 | 0 |
| 335.0 | 0 |
| 334.5 | 0 |
| 334.0 | 0 |
| 333.5 | 0 |
| 333.0 | 0 |
| 332.5 | 0 |
| 332.0 | 0 |
| 331.5 | 0 |
| 331.0 | 0 |
| 330.5 | 0 |
| 330.0 | 0 |
| 329.5 | 0 |
| 329.0 | 0 |
| 328.5 | 0 |
| 328.0 | 0 |
| 327.5 | 0 |
| 327.0 | 0 |
| 326.5 | 0 |
| 326.0 | 0 |
| 325.5 | 0 |
| 325.0 | 0 |
| 324.5 | 0 |
| 324.0 | 0 |
| 323.5 | 0 |
| 323.0 | -0.001 |
| 322.5 | 0 |
| 322.0 | 0 |
| 321.5 | 0 |
| 321.0 | 0 |
| 320.5 | 0 |
| 320.0 | 0 |
| 319.5 | 0 |
| 319.0 | 0 |
| 318.5 | 0 |
| 318.0 | 0 |
| 317.5 | 0 |
| 317.0 | 0 |
| 316.5 | 0 |
| 316.0 | 0 |
| 315.5 | 0 |
| 315.0 | 0 |
| 314.5 | 0 |
| 314.0 | 0 |
| 313.5 | 0 |
| 313.0 | 0 |
| 312.5 | 0 |
| 312.0 | 0 |
| 311.5 | 0 |
| 311.0 | 0 |
| 310.5 | 0 |
| 310.0 | 0 |
| 309.5 | 0 |
| 309.0 | 0 |
| 308.5 | 0 |
| 308.0 | 0 |
| 307.5 | 0 |
| 307.0 | 0 |
| 306.5 | 0 |
| 306.0 | 0 |
| 305.5 | 0 |
| 305.0 | 0 |
| 304.5 | 0 |
| 304.0 | 0 |
| 303.5 | 0 |
| 303.0 | 0 |
| 302.5 | 0 |
| 302.0 | 0 |
| 301.5 | 0 |
| 301.0 | 0 |
| 300.5 | 0 |
| 300.0 | 0 |